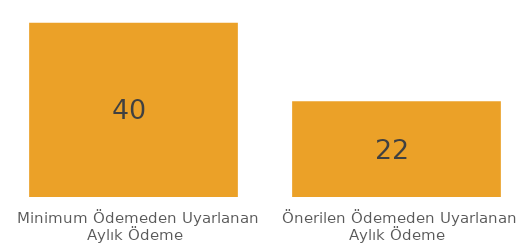
| Category | Series 0 |
|---|---|
| Minimum Ödemeden Uyarlanan Aylık Ödeme | 40 |
| Önerilen Ödemeden Uyarlanan Aylık Ödeme | 22 |